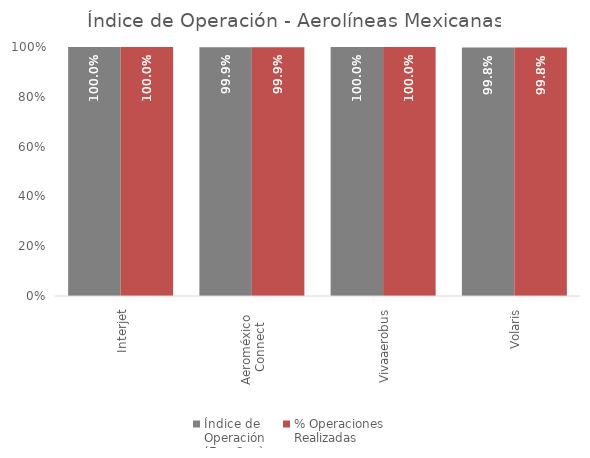
| Category | Índice de 
Operación
(Ene-Sep) | % Operaciones
Realizadas |
|---|---|---|
| Interjet | 1 | 1 |
| Aeroméxico 
Connect | 0.999 | 0.999 |
| Vivaaerobus | 1 | 1 |
| Volaris | 0.998 | 0.998 |